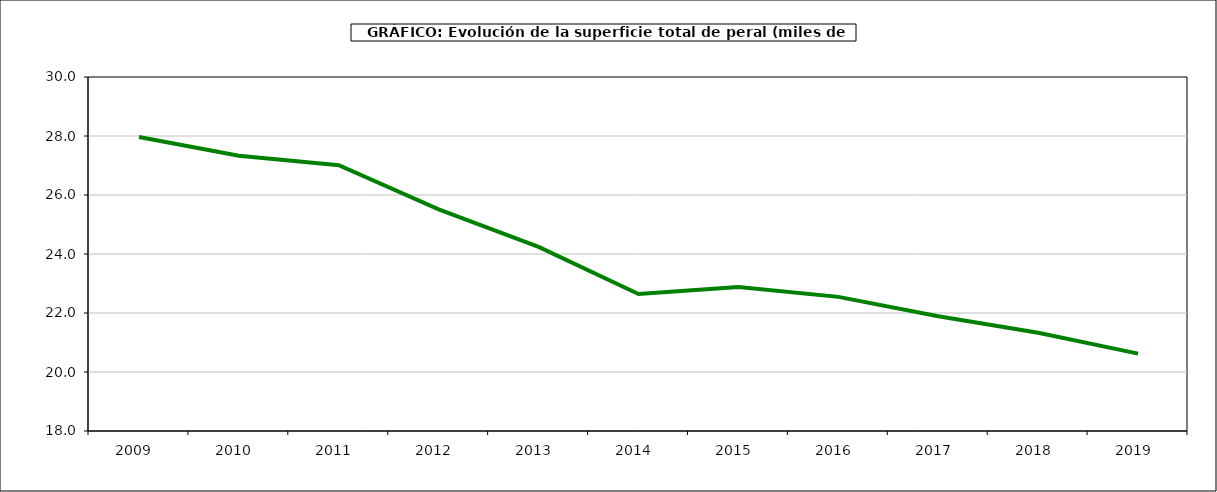
| Category | superficie peral |
|---|---|
| 2009.0 | 27.967 |
| 2010.0 | 27.331 |
| 2011.0 | 27.01 |
| 2012.0 | 25.512 |
| 2013.0 | 24.243 |
| 2014.0 | 22.643 |
| 2015.0 | 22.878 |
| 2016.0 | 22.547 |
| 2017.0 | 21.888 |
| 2018.0 | 21.329 |
| 2019.0 | 20.623 |